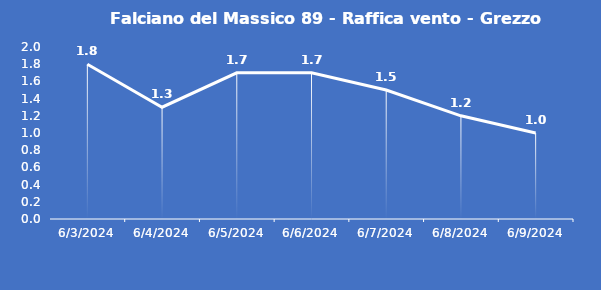
| Category | Falciano del Massico 89 - Raffica vento - Grezzo (m/s) |
|---|---|
| 6/3/24 | 1.8 |
| 6/4/24 | 1.3 |
| 6/5/24 | 1.7 |
| 6/6/24 | 1.7 |
| 6/7/24 | 1.5 |
| 6/8/24 | 1.2 |
| 6/9/24 | 1 |